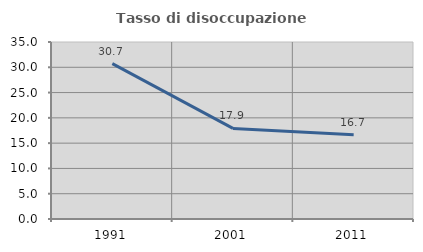
| Category | Tasso di disoccupazione giovanile  |
|---|---|
| 1991.0 | 30.719 |
| 2001.0 | 17.91 |
| 2011.0 | 16.667 |